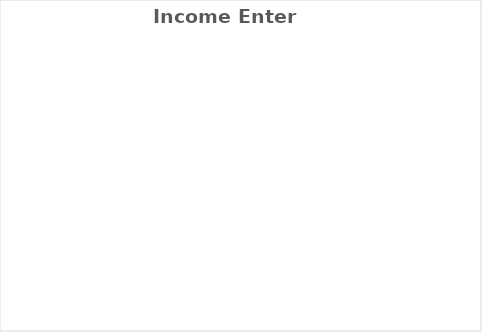
| Category | Actual YTD |
|---|---|
| Operations | 0 |
| Office of President | 0 |
| Programming | 0 |
| Sponsorship | 0 |
| Special Events | 0 |
| Membership | 0 |